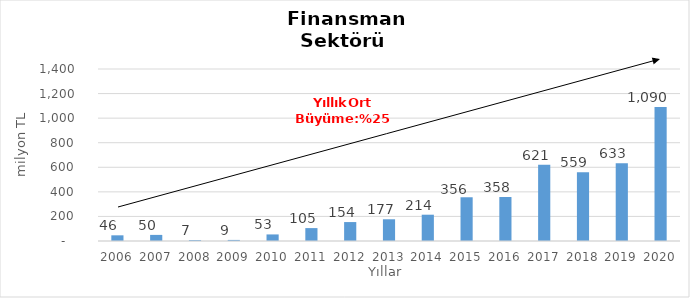
| Category | Finansman |
|---|---|
| 2006.0 | 46.209 |
| 2007.0 | 49.659 |
| 2008.0 | 7.339 |
| 2009.0 | 8.77 |
| 2010.0 | 53.492 |
| 2011.0 | 105.032 |
| 2012.0 | 154.13 |
| 2013.0 | 176.798 |
| 2014.0 | 214.053 |
| 2015.0 | 356 |
| 2016.0 | 358 |
| 2017.0 | 621 |
| 2018.0 | 559 |
| 2019.0 | 633 |
| 2020.0 | 1090 |